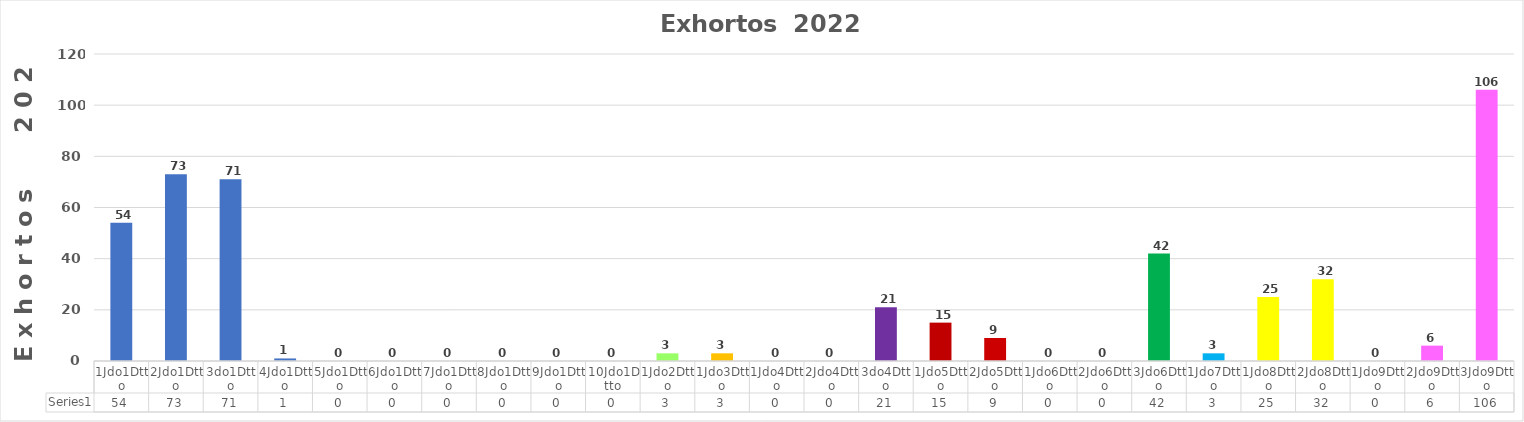
| Category | Series 0 |
|---|---|
| 1Jdo1Dtto | 54 |
| 2Jdo1Dtto | 73 |
| 3do1Dtto | 71 |
| 4Jdo1Dtto | 1 |
| 5Jdo1Dtto | 0 |
| 6Jdo1Dtto | 0 |
| 7Jdo1Dtto | 0 |
| 8Jdo1Dtto | 0 |
| 9Jdo1Dtto | 0 |
| 10Jdo1Dtto | 0 |
| 1Jdo2Dtto | 3 |
| 1Jdo3Dtto | 3 |
| 1Jdo4Dtto | 0 |
| 2Jdo4Dtto | 0 |
| 3do4Dtto | 21 |
| 1Jdo5Dtto | 15 |
| 2Jdo5Dtto | 9 |
| 1Jdo6Dtto | 0 |
| 2Jdo6Dtto | 0 |
| 3Jdo6Dtto | 42 |
| 1Jdo7Dtto | 3 |
| 1Jdo8Dtto | 25 |
| 2Jdo8Dtto | 32 |
| 1Jdo9Dtto | 0 |
| 2Jdo9Dtto | 6 |
| 3Jdo9Dtto | 106 |